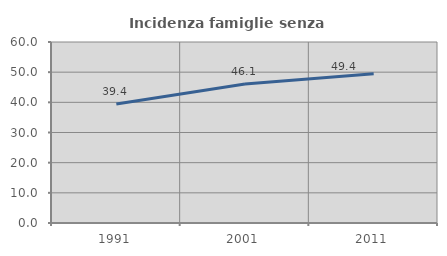
| Category | Incidenza famiglie senza nuclei |
|---|---|
| 1991.0 | 39.45 |
| 2001.0 | 46.078 |
| 2011.0 | 49.441 |